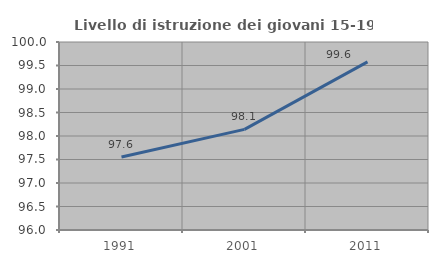
| Category | Livello di istruzione dei giovani 15-19 anni |
|---|---|
| 1991.0 | 97.552 |
| 2001.0 | 98.141 |
| 2011.0 | 99.576 |